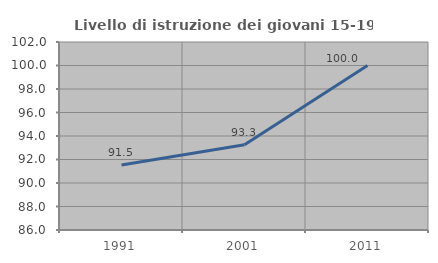
| Category | Livello di istruzione dei giovani 15-19 anni |
|---|---|
| 1991.0 | 91.538 |
| 2001.0 | 93.258 |
| 2011.0 | 100 |